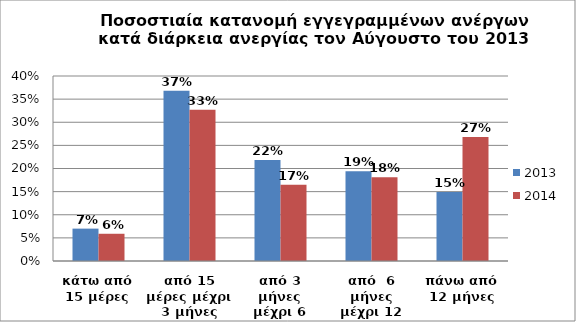
| Category | 2013 | 2014 |
|---|---|---|
| κάτω από 15 μέρες | 0.07 | 0.059 |
| από 15 μέρες μέχρι 3 μήνες | 0.368 | 0.327 |
| από 3 μήνες μέχρι 6 μήνες | 0.218 | 0.165 |
| από  6 μήνες μέχρι 12 μήνες | 0.194 | 0.181 |
| πάνω από 12 μήνες | 0.149 | 0.268 |